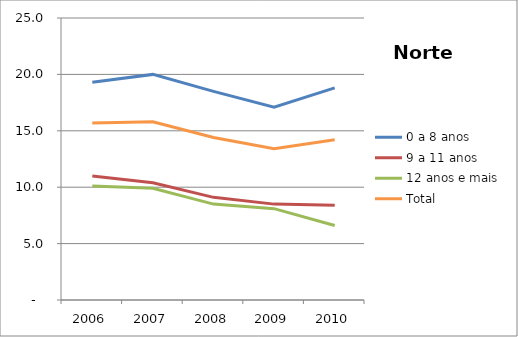
| Category | 0 a 8 anos | 9 a 11 anos | 12 anos e mais | Total |
|---|---|---|---|---|
| 2006.0 | 19.3 | 11 | 10.1 | 15.7 |
| 2007.0 | 20 | 10.4 | 9.9 | 15.8 |
| 2008.0 | 18.5 | 9.1 | 8.5 | 14.4 |
| 2009.0 | 17.1 | 8.5 | 8.1 | 13.4 |
| 2010.0 | 18.8 | 8.4 | 6.6 | 14.2 |